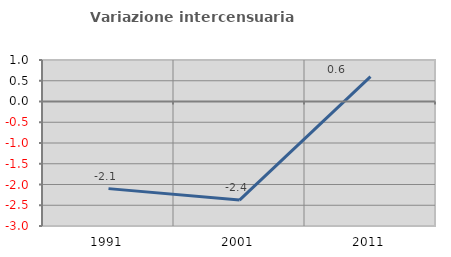
| Category | Variazione intercensuaria annua |
|---|---|
| 1991.0 | -2.099 |
| 2001.0 | -2.375 |
| 2011.0 | 0.6 |